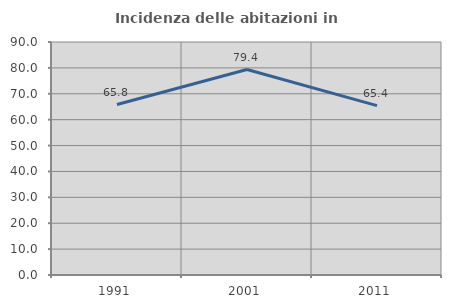
| Category | Incidenza delle abitazioni in proprietà  |
|---|---|
| 1991.0 | 65.831 |
| 2001.0 | 79.359 |
| 2011.0 | 65.414 |